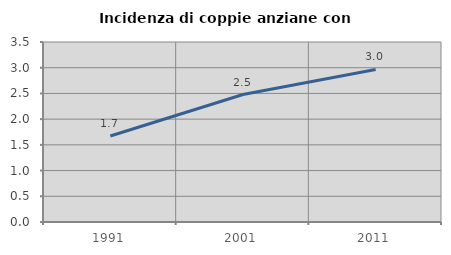
| Category | Incidenza di coppie anziane con figli |
|---|---|
| 1991.0 | 1.672 |
| 2001.0 | 2.479 |
| 2011.0 | 2.967 |